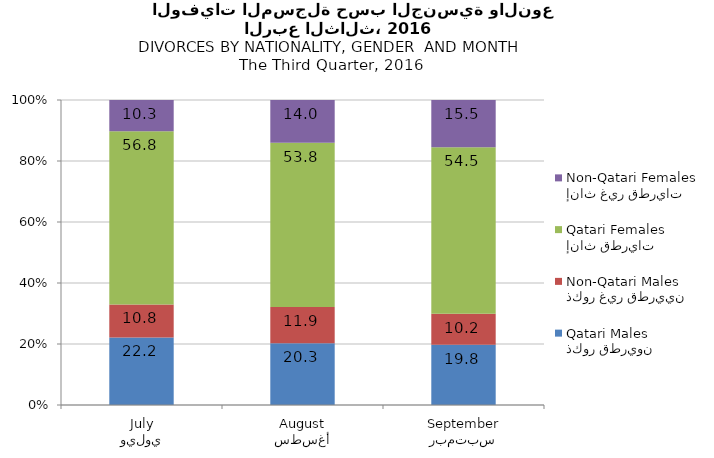
| Category | ذكور قطريون
Qatari Males | ذكور غير قطريين
Non-Qatari Males | إناث قطريات
Qatari Females | إناث غير قطريات
Non-Qatari Females |
|---|---|---|---|---|
| يوليو
July | 22.162 | 10.811 | 56.757 | 10.27 |
| أغسطس
August | 20.28 | 11.888 | 53.846 | 13.986 |
| سبتمبر
September | 19.786 | 10.16 | 54.545 | 15.508 |